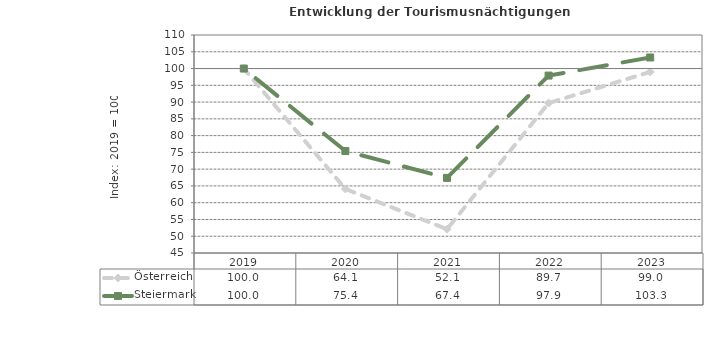
| Category | Österreich | Steiermark |
|---|---|---|
| 2023.0 | 99 | 103.3 |
| 2022.0 | 89.7 | 97.9 |
| 2021.0 | 52.1 | 67.4 |
| 2020.0 | 64.1 | 75.4 |
| 2019.0 | 100 | 100 |